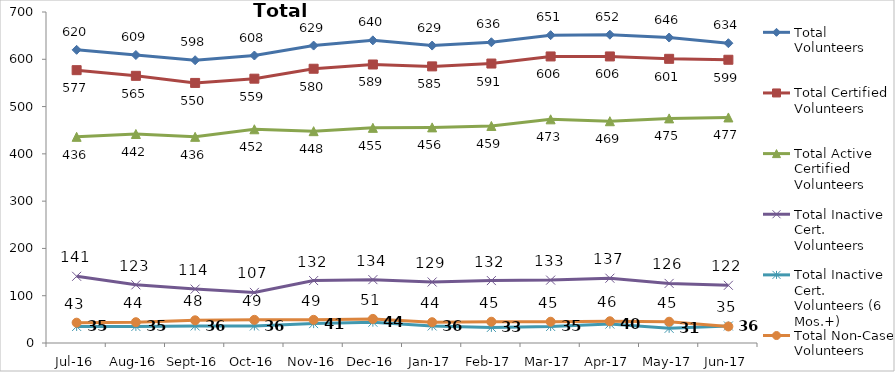
| Category | Total Volunteers | Total Certified Volunteers | Total Active Certified Volunteers | Total Inactive Cert. Volunteers | Total Inactive Cert. Volunteers (6 Mos.+) | Total Non-Case Volunteers |
|---|---|---|---|---|---|---|
| Jul-16 | 620 | 577 | 436 | 141 | 35 | 43 |
| Aug-16 | 609 | 565 | 442 | 123 | 35 | 44 |
| Sep-16 | 598 | 550 | 436 | 114 | 36 | 48 |
| Oct-16 | 608 | 559 | 452 | 107 | 36 | 49 |
| Nov-16 | 629 | 580 | 448 | 132 | 41 | 49 |
| Dec-16 | 640 | 589 | 455 | 134 | 44 | 51 |
| Jan-17 | 629 | 585 | 456 | 129 | 36 | 44 |
| Feb-17 | 636 | 591 | 459 | 132 | 33 | 45 |
| Mar-17 | 651 | 606 | 473 | 133 | 35 | 45 |
| Apr-17 | 652 | 606 | 469 | 137 | 40 | 46 |
| May-17 | 646 | 601 | 475 | 126 | 31 | 45 |
| Jun-17 | 634 | 599 | 477 | 122 | 36 | 35 |